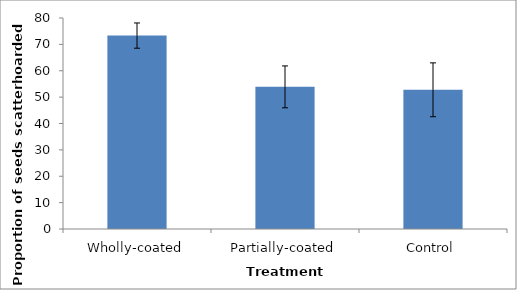
| Category | Series 0 |
|---|---|
| Wholly-coated | 73.333 |
| Partially-coated | 53.889 |
| Control | 52.778 |